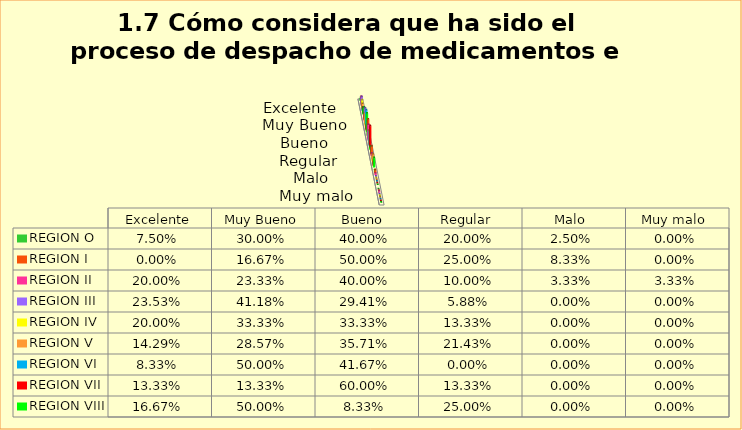
| Category | REGION O | REGION I  | REGION II | REGION III | REGION IV | REGION V  | REGION VI  | REGION VII  | REGION VIII |
|---|---|---|---|---|---|---|---|---|---|
| Excelente | 0.075 | 0 | 0.2 | 0.235 | 0.2 | 0.143 | 0.083 | 0.133 | 0.167 |
| Muy Bueno | 0.3 | 0.167 | 0.233 | 0.412 | 0.333 | 0.286 | 0.5 | 0.133 | 0.5 |
| Bueno  | 0.4 | 0.5 | 0.4 | 0.294 | 0.333 | 0.357 | 0.417 | 0.6 | 0.083 |
| Regular  | 0.2 | 0.25 | 0.1 | 0.059 | 0.133 | 0.214 | 0 | 0.133 | 0.25 |
| Malo  | 0.025 | 0.083 | 0.033 | 0 | 0 | 0 | 0 | 0 | 0 |
| Muy malo  | 0 | 0 | 0.033 | 0 | 0 | 0 | 0 | 0 | 0 |